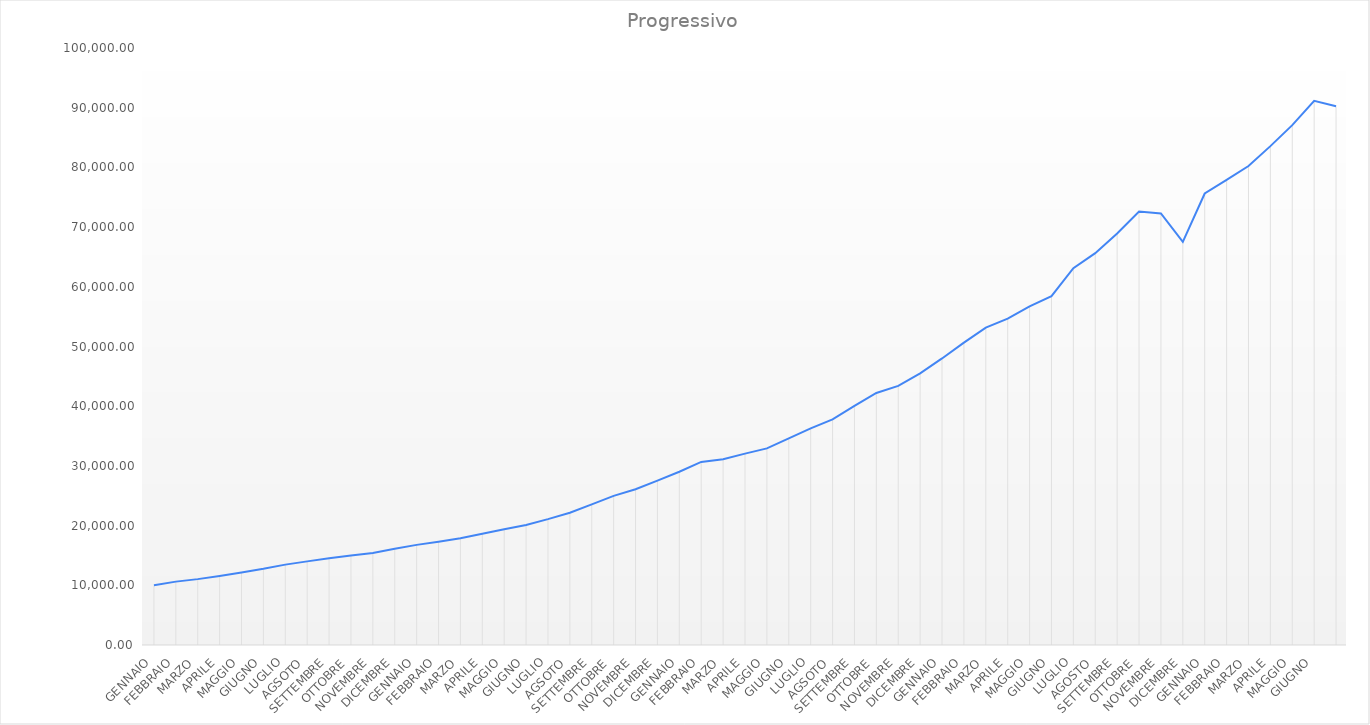
| Category | Series 0 |
|---|---|
| GENNAIO | 10000 |
| FEBBRAIO | 10615 |
| MARZO | 11034.292 |
| APRILE | 11552.904 |
| MAGGIO | 12153.655 |
| GIUGNO | 12761.338 |
| LUGLIO | 13463.212 |
| AGSOTO | 14008.472 |
| SETTEMBRE | 14540.794 |
| OTTOBRE | 14977.017 |
| NOVEMBRE | 15396.374 |
| DICEMBRE | 16104.607 |
| GENNAIO | 16772.948 |
| FEBBRAIO | 17292.91 |
| MARZO | 17872.222 |
| APRILE | 18631.792 |
| MAGGIO | 19377.063 |
| GIUGNO | 20103.703 |
| LUGLIO | 21078.733 |
| AGSOTO | 22153.748 |
| SETTEMBRE | 23560.511 |
| OTTOBRE | 24974.142 |
| NOVEMBRE | 26097.978 |
| DICEMBRE | 27533.367 |
| GENNAIO | 29020.169 |
| FEBBRAIO | 30659.808 |
| MARZO | 31119.705 |
| APRILE | 32053.297 |
| MAGGIO | 32934.762 |
| GIUGNO | 34614.435 |
| LUGLIO | 36275.928 |
| AGSOTO | 37781.379 |
| SETTEMBRE | 40048.262 |
| OTTOBRE | 42210.868 |
| NOVEMBRE | 43392.772 |
| DICEMBRE | 45497.322 |
| GENNAIO | 47999.674 |
| FEBBRAIO | 50639.657 |
| MARZO | 53171.639 |
| APRILE | 54660.445 |
| MAGGIO | 56737.542 |
| GIUGNO | 58439.668 |
| LUGLIO | 63114.842 |
| AGOSTO | 65639.43 |
| SETTEMBRE | 68921.4 |
| OTTOBRE | 72608.69 |
| NOVEMBRE | 72295.21 |
| DICEMBRE | 67523.73 |
| GENNAIO | 75626.57 |
| FEBBRAIO | 77895.36 |
| MARZO | 80232.22 |
| APRILE | 83561.86 |
| MAGGIO | 87079.81 |
| GIUGNO | 91146.43 |